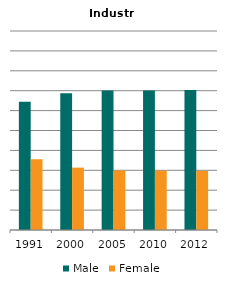
| Category | Male | Female |
|---|---|---|
| 1991.0 | 0.645 | 0.355 |
| 2000.0 | 0.687 | 0.313 |
| 2005.0 | 0.701 | 0.299 |
| 2010.0 | 0.701 | 0.299 |
| 2012.0 | 0.703 | 0.297 |